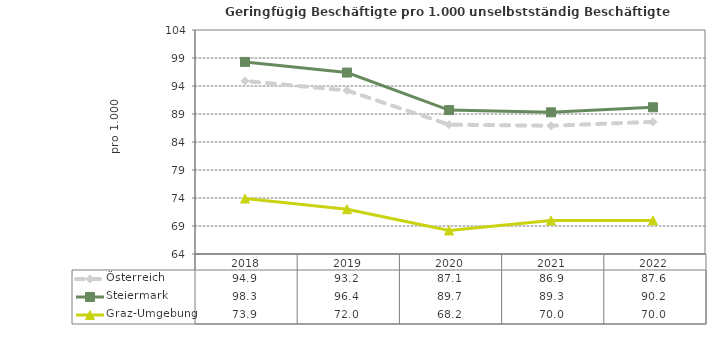
| Category | Österreich | Steiermark | Graz-Umgebung |
|---|---|---|---|
| 2022.0 | 87.6 | 90.2 | 70 |
| 2021.0 | 86.9 | 89.3 | 70 |
| 2020.0 | 87.1 | 89.7 | 68.2 |
| 2019.0 | 93.2 | 96.4 | 72 |
| 2018.0 | 94.9 | 98.3 | 73.9 |